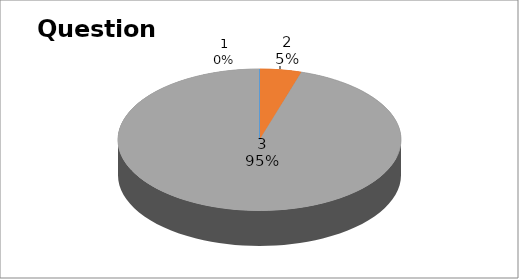
| Category | Series 0 |
|---|---|
| 0 | 0 |
| 1 | 1 |
| 2 | 20 |